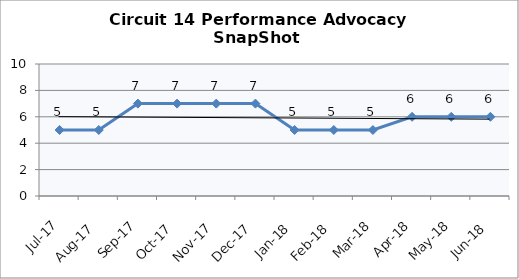
| Category | Circuit 14 |
|---|---|
| Jul-17 | 5 |
| Aug-17 | 5 |
| Sep-17 | 7 |
| Oct-17 | 7 |
| Nov-17 | 7 |
| Dec-17 | 7 |
| Jan-18 | 5 |
| Feb-18 | 5 |
| Mar-18 | 5 |
| Apr-18 | 6 |
| May-18 | 6 |
| Jun-18 | 6 |